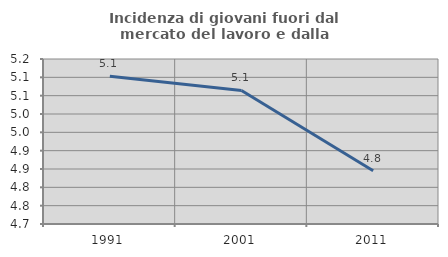
| Category | Incidenza di giovani fuori dal mercato del lavoro e dalla formazione  |
|---|---|
| 1991.0 | 5.103 |
| 2001.0 | 5.064 |
| 2011.0 | 4.845 |